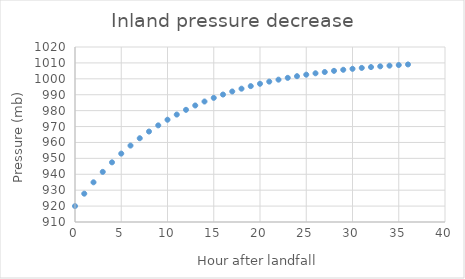
| Category | Series 0 |
|---|---|
| 0.0 | 920 |
| 1.0 | 927.804 |
| 2.0 | 934.952 |
| 3.0 | 941.501 |
| 4.0 | 947.501 |
| 5.0 | 952.997 |
| 6.0 | 958.032 |
| 7.0 | 962.644 |
| 8.0 | 966.869 |
| 9.0 | 970.74 |
| 10.0 | 974.286 |
| 11.0 | 977.535 |
| 12.0 | 980.51 |
| 13.0 | 983.237 |
| 14.0 | 985.734 |
| 15.0 | 988.022 |
| 16.0 | 990.118 |
| 17.0 | 992.038 |
| 18.0 | 993.797 |
| 19.0 | 995.408 |
| 20.0 | 996.884 |
| 21.0 | 998.236 |
| 22.0 | 999.475 |
| 23.0 | 1000.61 |
| 24.0 | 1001.65 |
| 25.0 | 1002.602 |
| 26.0 | 1003.475 |
| 27.0 | 1004.274 |
| 28.0 | 1005.006 |
| 29.0 | 1005.677 |
| 30.0 | 1006.291 |
| 31.0 | 1006.854 |
| 32.0 | 1007.37 |
| 33.0 | 1007.842 |
| 34.0 | 1008.275 |
| 35.0 | 1008.672 |
| 36.0 | 1009.035 |